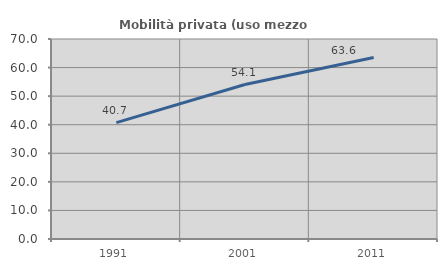
| Category | Mobilità privata (uso mezzo privato) |
|---|---|
| 1991.0 | 40.748 |
| 2001.0 | 54.067 |
| 2011.0 | 63.554 |